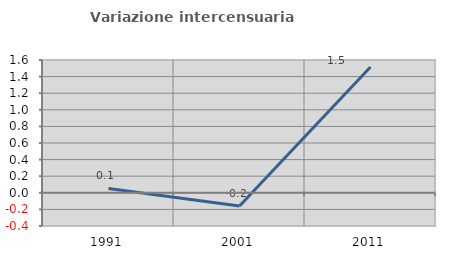
| Category | Variazione intercensuaria annua |
|---|---|
| 1991.0 | 0.053 |
| 2001.0 | -0.159 |
| 2011.0 | 1.515 |